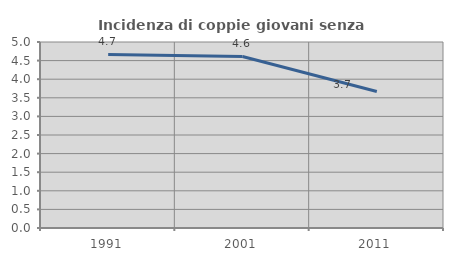
| Category | Incidenza di coppie giovani senza figli |
|---|---|
| 1991.0 | 4.667 |
| 2001.0 | 4.611 |
| 2011.0 | 3.669 |